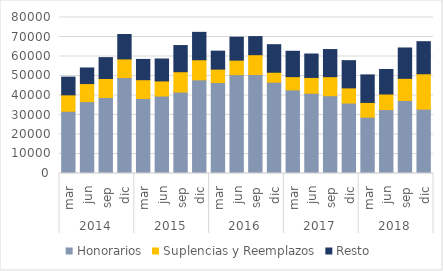
| Category | Honorarios | Suplencias y Reemplazos | Resto |
|---|---|---|---|
| 0 | 31922 | 8416 | 9086 |
| 1 | 36837 | 9283 | 7997 |
| 2 | 38967 | 9748 | 10708 |
| 3 | 49201 | 9551 | 12520 |
| 4 | 38453 | 9652 | 10401 |
| 5 | 39716 | 7758 | 11256 |
| 6 | 41773 | 10420 | 13422 |
| 7 | 48031 | 10301 | 14051 |
| 8 | 46644 | 6882 | 9221 |
| 9 | 50687 | 7441 | 11777 |
| 10 | 50774 | 10151 | 9284 |
| 11 | 46824 | 5109 | 14125 |
| 12 | 42875 | 6793 | 13005 |
| 13 | 41166 | 8092 | 12020 |
| 14 | 39900 | 9754 | 13911 |
| 15 | 36125 | 7789 | 13957 |
| 16 | 28887 | 7554 | 14131 |
| 17 | 32795 | 7964 | 12577 |
| 18 | 37450 | 11349 | 15577 |
| 19 | 33005 | 18139 | 16446 |